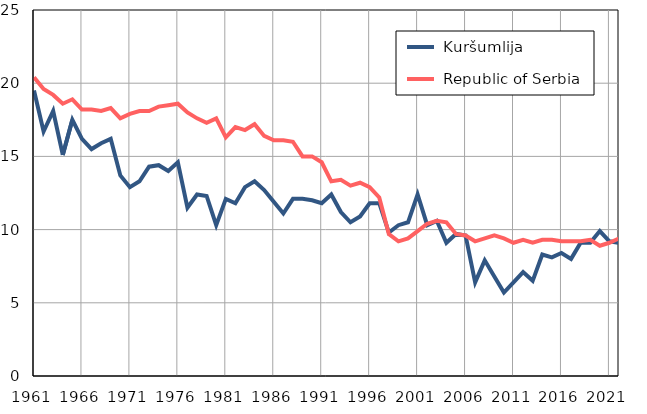
| Category |  Kuršumlija |  Republic of Serbia |
|---|---|---|
| 1961.0 | 19.5 | 20.4 |
| 1962.0 | 16.7 | 19.6 |
| 1963.0 | 18.1 | 19.2 |
| 1964.0 | 15.1 | 18.6 |
| 1965.0 | 17.5 | 18.9 |
| 1966.0 | 16.2 | 18.2 |
| 1967.0 | 15.5 | 18.2 |
| 1968.0 | 15.9 | 18.1 |
| 1969.0 | 16.2 | 18.3 |
| 1970.0 | 13.7 | 17.6 |
| 1971.0 | 12.9 | 17.9 |
| 1972.0 | 13.3 | 18.1 |
| 1973.0 | 14.3 | 18.1 |
| 1974.0 | 14.4 | 18.4 |
| 1975.0 | 14 | 18.5 |
| 1976.0 | 14.6 | 18.6 |
| 1977.0 | 11.5 | 18 |
| 1978.0 | 12.4 | 17.6 |
| 1979.0 | 12.3 | 17.3 |
| 1980.0 | 10.3 | 17.6 |
| 1981.0 | 12.1 | 16.3 |
| 1982.0 | 11.8 | 17 |
| 1983.0 | 12.9 | 16.8 |
| 1984.0 | 13.3 | 17.2 |
| 1985.0 | 12.7 | 16.4 |
| 1986.0 | 11.9 | 16.1 |
| 1987.0 | 11.1 | 16.1 |
| 1988.0 | 12.1 | 16 |
| 1989.0 | 12.1 | 15 |
| 1990.0 | 12 | 15 |
| 1991.0 | 11.8 | 14.6 |
| 1992.0 | 12.4 | 13.3 |
| 1993.0 | 11.2 | 13.4 |
| 1994.0 | 10.5 | 13 |
| 1995.0 | 10.9 | 13.2 |
| 1996.0 | 11.8 | 12.9 |
| 1997.0 | 11.8 | 12.2 |
| 1998.0 | 9.8 | 9.7 |
| 1999.0 | 10.3 | 9.2 |
| 2000.0 | 10.5 | 9.4 |
| 2001.0 | 12.4 | 9.9 |
| 2002.0 | 10.3 | 10.4 |
| 2003.0 | 10.6 | 10.6 |
| 2004.0 | 9.1 | 10.5 |
| 2005.0 | 9.7 | 9.7 |
| 2006.0 | 9.6 | 9.6 |
| 2007.0 | 6.4 | 9.2 |
| 2008.0 | 7.9 | 9.4 |
| 2009.0 | 6.8 | 9.6 |
| 2010.0 | 5.7 | 9.4 |
| 2011.0 | 6.4 | 9.1 |
| 2012.0 | 7.1 | 9.3 |
| 2013.0 | 6.5 | 9.1 |
| 2014.0 | 8.3 | 9.3 |
| 2015.0 | 8.1 | 9.3 |
| 2016.0 | 8.4 | 9.2 |
| 2017.0 | 8 | 9.2 |
| 2018.0 | 9.1 | 9.2 |
| 2019.0 | 9.1 | 9.3 |
| 2020.0 | 9.9 | 8.9 |
| 2021.0 | 9.2 | 9.1 |
| 2022.0 | 9.1 | 9.4 |